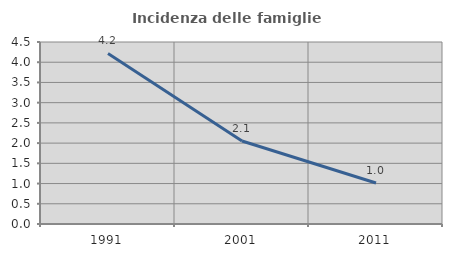
| Category | Incidenza delle famiglie numerose |
|---|---|
| 1991.0 | 4.217 |
| 2001.0 | 2.053 |
| 2011.0 | 1.014 |